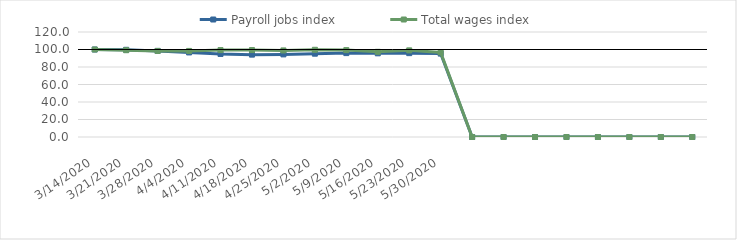
| Category | Payroll jobs index | Total wages index |
|---|---|---|
| 14/03/2020 | 100 | 100 |
| 21/03/2020 | 99.655 | 99.192 |
| 28/03/2020 | 98.405 | 98.339 |
| 04/04/2020 | 96.642 | 98.357 |
| 11/04/2020 | 94.911 | 99.303 |
| 18/04/2020 | 94.134 | 99.373 |
| 25/04/2020 | 94.399 | 98.936 |
| 02/05/2020 | 95.211 | 99.67 |
| 09/05/2020 | 95.887 | 99.288 |
| 16/05/2020 | 95.634 | 97.341 |
| 23/05/2020 | 95.837 | 99.015 |
| 30/05/2020 | 95.325 | 96.645 |